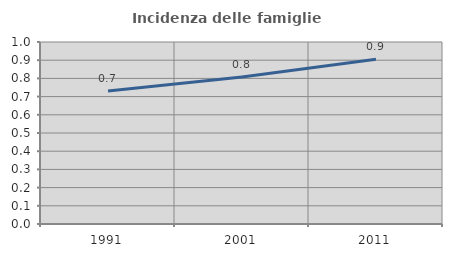
| Category | Incidenza delle famiglie numerose |
|---|---|
| 1991.0 | 0.731 |
| 2001.0 | 0.808 |
| 2011.0 | 0.905 |